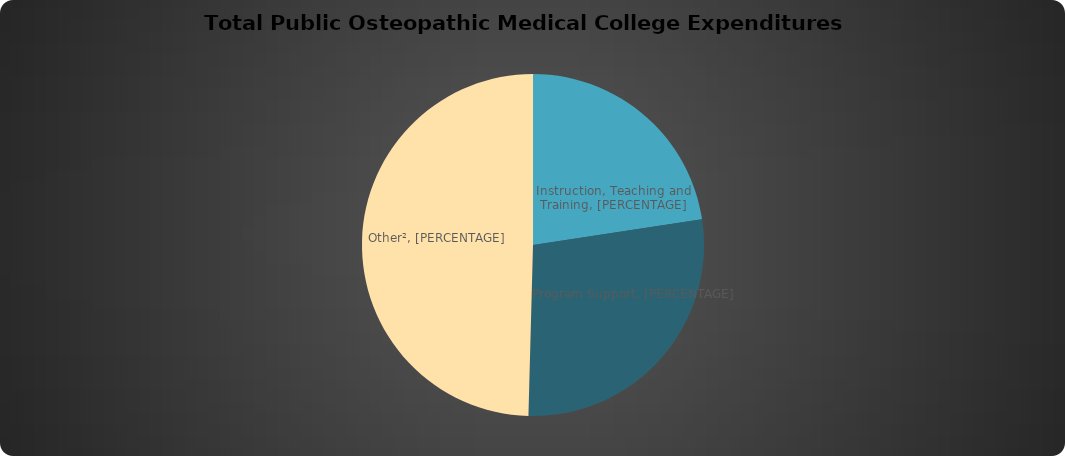
| Category | Series 0 |
|---|---|
| 0 | 207742157 |
| 1 | 255646568 |
| 2 | 455607596 |